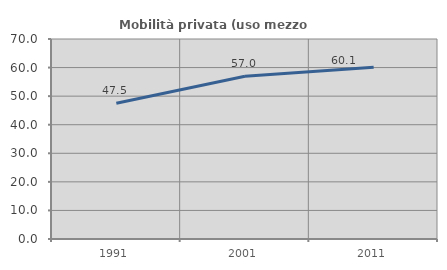
| Category | Mobilità privata (uso mezzo privato) |
|---|---|
| 1991.0 | 47.527 |
| 2001.0 | 56.958 |
| 2011.0 | 60.122 |